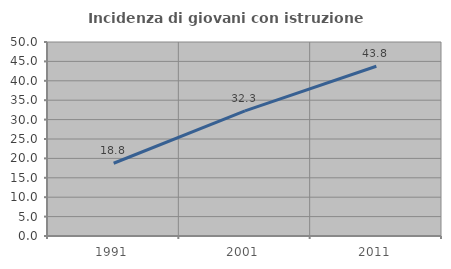
| Category | Incidenza di giovani con istruzione universitaria |
|---|---|
| 1991.0 | 18.75 |
| 2001.0 | 32.258 |
| 2011.0 | 43.75 |